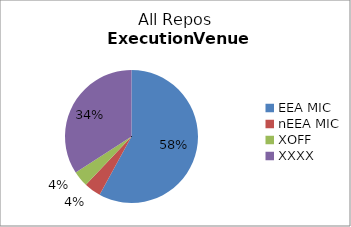
| Category | Series 0 |
|---|---|
| EEA MIC | 9134515.894 |
| nEEA MIC | 643383.87 |
| XOFF | 601686.335 |
| XXXX | 5379310.634 |